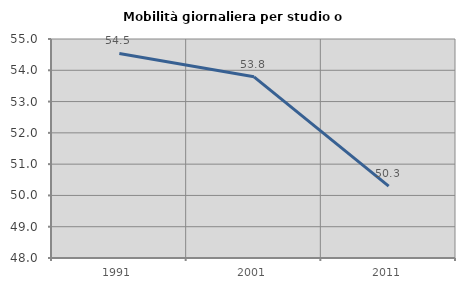
| Category | Mobilità giornaliera per studio o lavoro |
|---|---|
| 1991.0 | 54.539 |
| 2001.0 | 53.791 |
| 2011.0 | 50.295 |